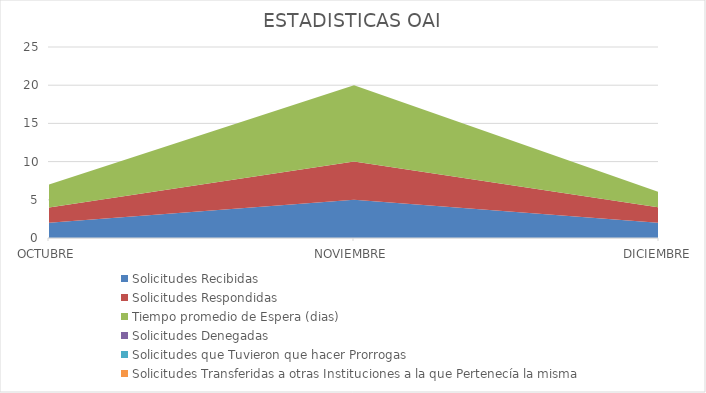
| Category | Solicitudes Recibidas | Solicitudes Respondidas | Tiempo promedio de Espera (dias) | Solicitudes Denegadas | Solicitudes que Tuvieron que hacer Prorrogas  | Solicitudes Transferidas a otras Instituciones a la que Pertenecía la misma |
|---|---|---|---|---|---|---|
| OCTUBRE | 2 | 2 | 3 | 0 | 0 | 0 |
| NOVIEMBRE | 5 | 5 | 10 | 0 | 0 | 0 |
| DICIEMBRE | 2 | 2 | 2 | 0 | 0 | 0 |